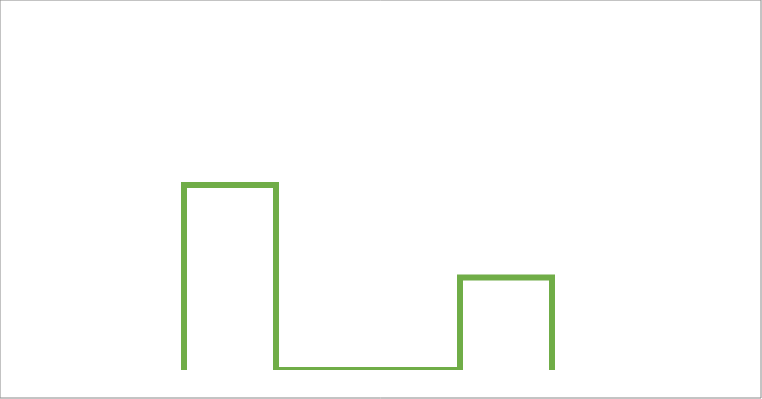
| Category | Series 0 |
|---|---|
| -60.0 | 0 |
| -60.0 | 40 |
| -30.0 | 40 |
| -30.0 | 0 |
| 30.0 | 0 |
| 30.0 | 20 |
| 60.0 | 20 |
| 60.0 | 0 |